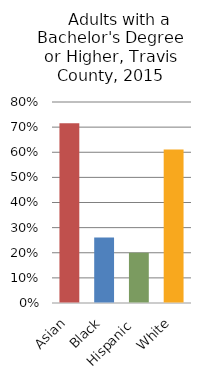
| Category |     Bachelor's degree or higher |
|---|---|
| Asian | 0.716 |
| Black | 0.261 |
| Hispanic  | 0.2 |
| White | 0.611 |